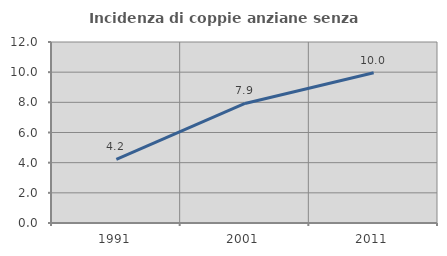
| Category | Incidenza di coppie anziane senza figli  |
|---|---|
| 1991.0 | 4.222 |
| 2001.0 | 7.925 |
| 2011.0 | 9.962 |